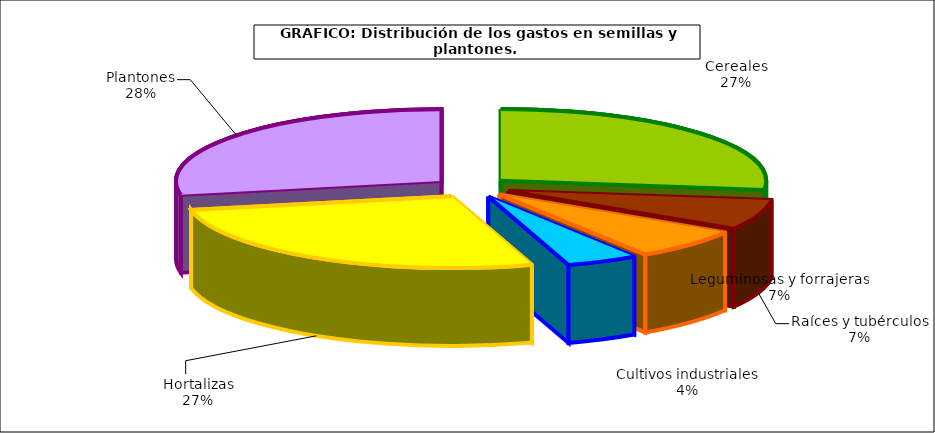
| Category | Series 0 |
|---|---|
| 0 | 335.712 |
| 1 | 84.376 |
| 2 | 85.763 |
| 3 | 54.354 |
| 4 | 333.088 |
| 5 | 348.55 |